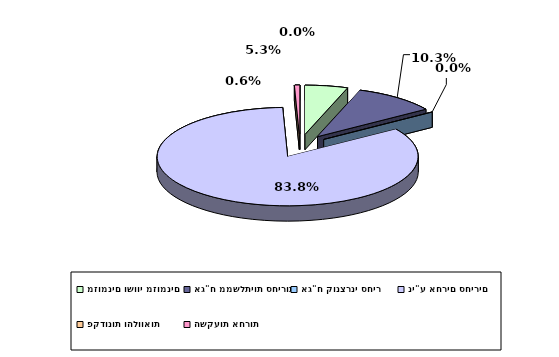
| Category | Series 0 |
|---|---|
| מזומנים ושווי מזומנים | 0.053 |
| אג"ח ממשלתיות סחירות | 0.103 |
| אג"ח קונצרני סחיר | 0 |
| ני"ע אחרים סחירים | 0.838 |
| פקדונות והלוואות | 0 |
| השקעות אחרות | 0.006 |